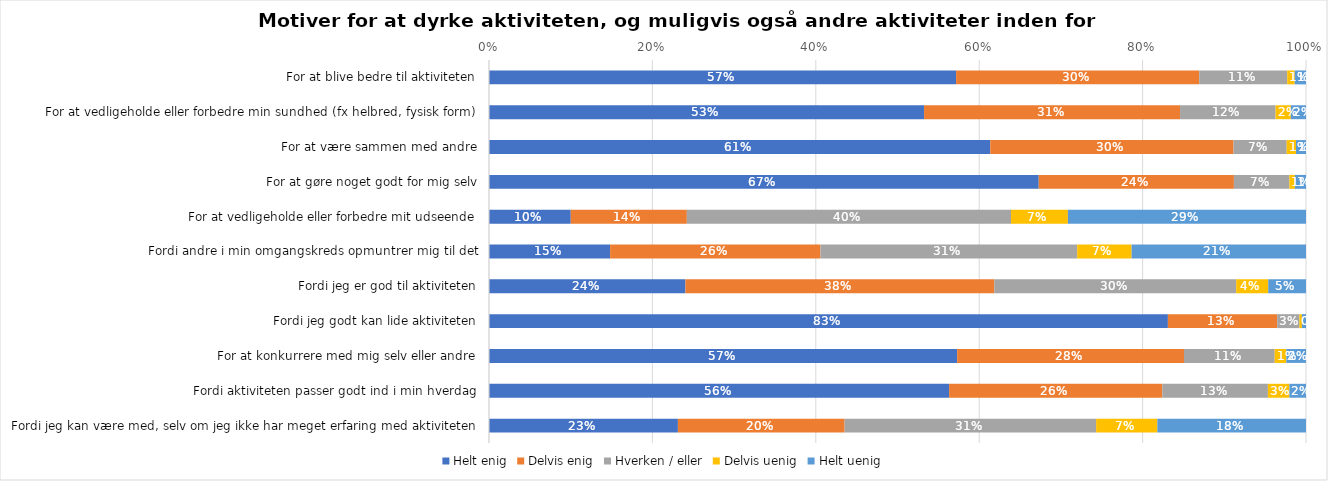
| Category | Helt enig | Delvis enig | Hverken / eller | Delvis uenig | Helt uenig |
|---|---|---|---|---|---|
| For at blive bedre til aktiviteten | 0.572 | 0.298 | 0.108 | 0.009 | 0.014 |
| For at vedligeholde eller forbedre min sundhed (fx helbred, fysisk form) | 0.533 | 0.313 | 0.117 | 0.019 | 0.019 |
| For at være sammen med andre | 0.614 | 0.298 | 0.065 | 0.011 | 0.012 |
| For at gøre noget godt for mig selv | 0.673 | 0.239 | 0.068 | 0.007 | 0.014 |
| For at vedligeholde eller forbedre mit udseende | 0.1 | 0.142 | 0.397 | 0.07 | 0.291 |
| Fordi andre i min omgangskreds opmuntrer mig til det | 0.148 | 0.257 | 0.314 | 0.067 | 0.213 |
| Fordi jeg er god til aktiviteten | 0.24 | 0.378 | 0.296 | 0.039 | 0.046 |
| Fordi jeg godt kan lide aktiviteten | 0.831 | 0.134 | 0.027 | 0.003 | 0.005 |
| For at konkurrere med mig selv eller andre | 0.573 | 0.278 | 0.111 | 0.014 | 0.024 |
| Fordi aktiviteten passer godt ind i min hverdag | 0.563 | 0.261 | 0.129 | 0.026 | 0.02 |
| Fordi jeg kan være med, selv om jeg ikke har meget erfaring med aktiviteten | 0.231 | 0.204 | 0.308 | 0.075 | 0.182 |